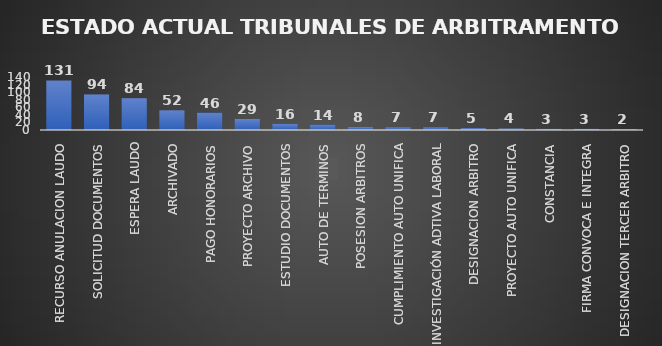
| Category | CANTIDAD | % |
|---|---|---|
| RECURSO ANULACION LAUDO | 131 | 0.26 |
| SOLICITUD DOCUMENTOS | 94 | 0.187 |
| ESPERA LAUDO | 84 | 0.137 |
| ARCHIVADO | 52 | 0.104 |
| PAGO HONORARIOS | 46 | 0.084 |
| PROYECTO ARCHIVO | 29 | 0.063 |
| ESTUDIO DOCUMENTOS | 16 | 0.033 |
| AUTO DE TERMINOS | 14 | 0.033 |
| POSESION ARBITROS | 8 | 0.017 |
| CUMPLIMIENTO AUTO UNIFICA | 7 | 0.013 |
| INVESTIGACIÓN ADTIVA LABORAL | 7 | 0.013 |
| DESIGNACION ARBITRO | 5 | 0.011 |
| PROYECTO AUTO UNIFICA | 4 | 0.003 |
| CONSTANCIA | 3 | 0.008 |
| FIRMA CONVOCA E INTEGRA | 3 | 0.004 |
| DESIGNACION TERCER ARBITRO | 2 | 0.006 |